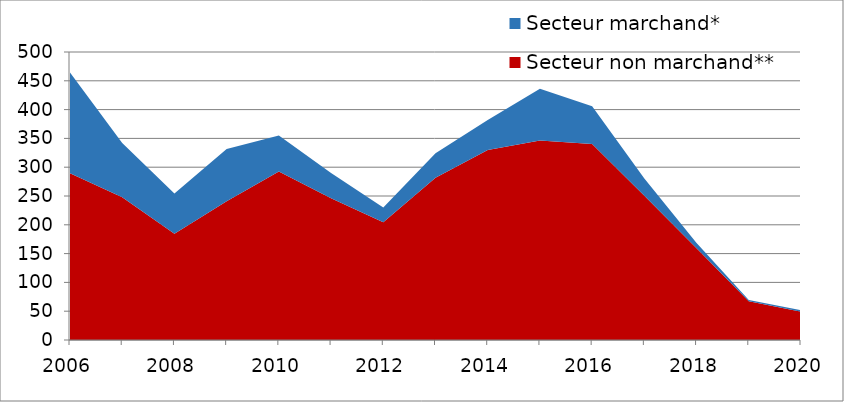
| Category | Secteur non marchand** | Secteur marchand* |
|---|---|---|
| 2006.0 | 289.53 | 174.983 |
| 2007.0 | 247.713 | 94.224 |
| 2008.0 | 184.436 | 69.914 |
| 2009.0 | 240.871 | 90.654 |
| 2010.0 | 292.661 | 62.382 |
| 2011.0 | 246.216 | 43.5 |
| 2012.0 | 204.435 | 25.641 |
| 2013.0 | 281.695 | 42.35 |
| 2014.0 | 329.766 | 52.103 |
| 2015.0 | 346.554 | 89.722 |
| 2016.0 | 340.083 | 65.922 |
| 2017.0 | 250.617 | 29.909 |
| 2018.0 | 159.176 | 9.147 |
| 2019.0 | 67.165 | 2.286 |
| 2020.0 | 49.134 | 2.675 |